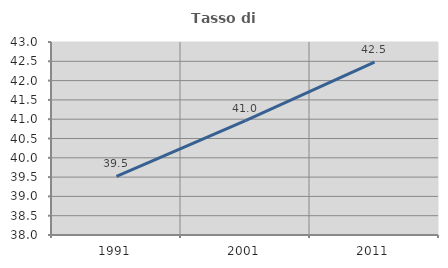
| Category | Tasso di occupazione   |
|---|---|
| 1991.0 | 39.516 |
| 2001.0 | 40.961 |
| 2011.0 | 42.478 |